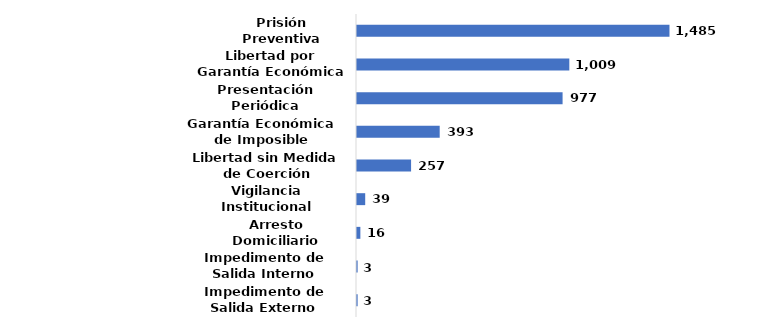
| Category | Series 0 |
|---|---|
| Impedimento de Salida Externo | 0.001 |
| Impedimento de Salida Interno | 0.001 |
| Arresto Domiciliario | 0.004 |
| Vigilancia Institucional | 0.009 |
| Libertad sin Medida de Coerción | 0.061 |
| Garantía Económica de Imposible Cumplimiento | 0.094 |
| Presentación Periódica | 0.234 |
| Libertad por Garantía Económica | 0.241 |
| Prisión Preventiva | 0.355 |